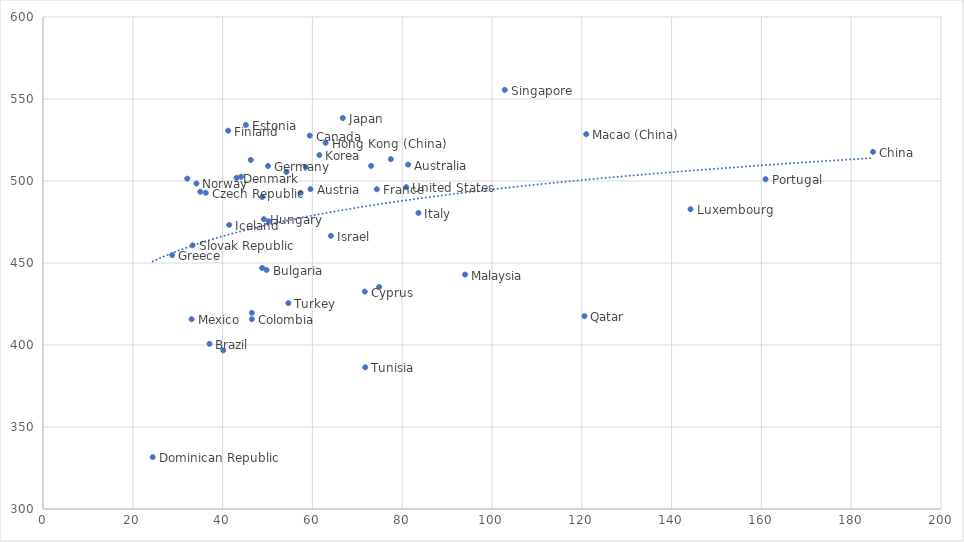
| Category | Series 0 |
|---|---|
| 81.3093652658367 | 509.994 |
| 59.5783384610759 | 495.037 |
| 37.0816090312935 | 400.682 |
| 49.7934022140412 | 445.772 |
| 59.4133388941647 | 527.705 |
| 48.8033071957895 | 446.956 |
| 184.860368017425 | 517.779 |
| 46.5175212013018 | 415.729 |
| 46.5196353695244 | 419.608 |
| 71.6736686208181 | 432.577 |
| 36.2389631307723 | 492.83 |
| 43.110228661328 | 501.937 |
| 24.4375642713993 | 331.639 |
| 45.1746443777033 | 534.194 |
| 41.2419515531995 | 530.661 |
| 74.346704685572 | 494.978 |
| 50.1186695742593 | 509.141 |
| 28.7701951605197 | 454.829 |
| 62.9365936687358 | 523.277 |
| 49.1962970281415 | 476.748 |
| 41.4715403780214 | 473.23 |
| 44.1162648751356 | 502.575 |
| 64.1251537056022 | 466.553 |
| 83.6148051503859 | 480.547 |
| 66.7567889886783 | 538.395 |
| 61.5619540999204 | 515.81 |
| 48.8300929604903 | 490.225 |
| 50.2564833580049 | 475.409 |
| 144.220585661907 | 482.806 |
| 120.986465480082 | 528.55 |
| 94.0007959244466 | 442.948 |
| 33.0910166468455 | 415.71 |
| 58.5045198204757 | 508.575 |
| 77.4658007986499 | 513.304 |
| 34.1767697908561 | 498.481 |
| 40.1503121352657 | 396.684 |
| 32.1249851995183 | 501.435 |
| 160.917293681148 | 501.1 |
| 120.598542816353 | 417.611 |
| 102.844202077835 | 555.575 |
| 33.3169379043871 | 460.775 |
| 46.2667797191593 | 512.864 |
| 57.3671187389755 | 492.786 |
| 35.0182996482295 | 493.422 |
| 54.2192357998888 | 505.506 |
| 71.7770805210753 | 386.403 |
| 54.6554203636603 | 425.49 |
| 73.0636271175034 | 509.222 |
| 80.9027041158884 | 496.242 |
| 74.8739235152358 | 435.363 |